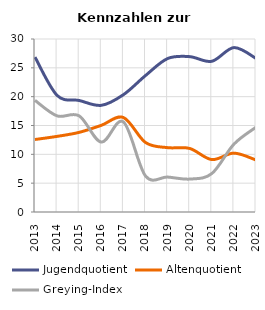
| Category | Jugendquotient | Altenquotient | Greying-Index |
|---|---|---|---|
| 2013.0 | 26.857 | 12.571 | 19.355 |
| 2014.0 | 20.219 | 13.115 | 16.667 |
| 2015.0 | 19.337 | 13.812 | 16.667 |
| 2016.0 | 18.497 | 15.029 | 12.121 |
| 2017.0 | 20.339 | 16.384 | 15.625 |
| 2018.0 | 23.661 | 12.054 | 6.25 |
| 2019.0 | 26.609 | 11.159 | 6.061 |
| 2020.0 | 26.94 | 11.02 | 5.71 |
| 2021.0 | 26.136 | 9.091 | 6.667 |
| 2022.0 | 28.51 | 10.21 | 11.76 |
| 2023.0 | 26.639 | 9.016 | 14.706 |